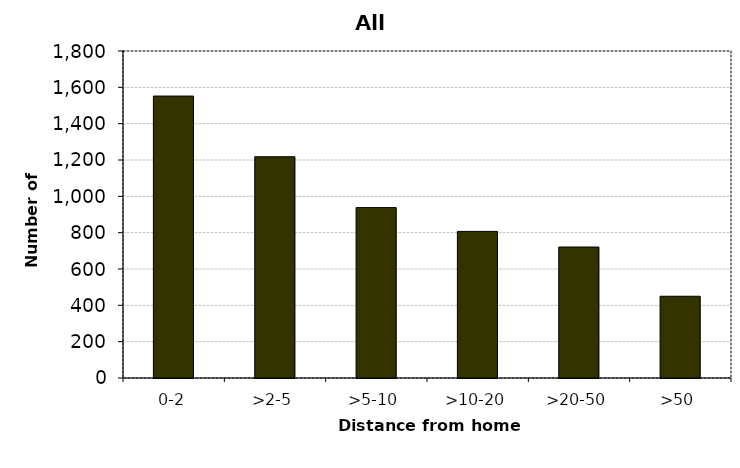
| Category | All drivers |
|---|---|
| 0-2 | 1552 |
| >2-5 | 1218 |
| >5-10 | 938 |
| >10-20 | 807 |
| >20-50 | 721 |
| >50 | 450 |